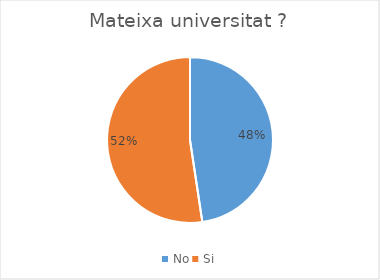
| Category | Series 0 |
|---|---|
| No | 20 |
| Si | 22 |